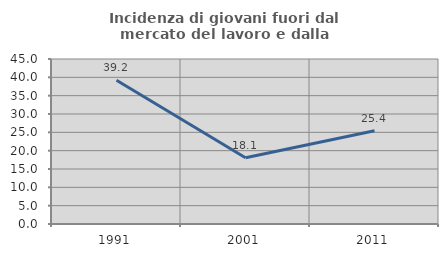
| Category | Incidenza di giovani fuori dal mercato del lavoro e dalla formazione  |
|---|---|
| 1991.0 | 39.209 |
| 2001.0 | 18.071 |
| 2011.0 | 25.437 |